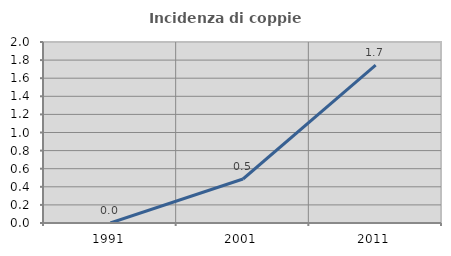
| Category | Incidenza di coppie miste |
|---|---|
| 1991.0 | 0 |
| 2001.0 | 0.486 |
| 2011.0 | 1.744 |